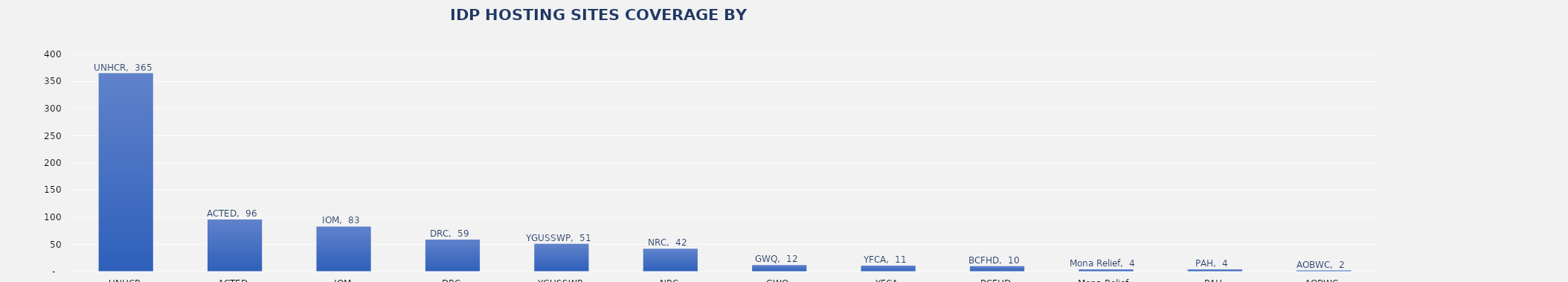
| Category | Total |
|---|---|
| UNHCR | 365 |
| ACTED | 96 |
| IOM | 83 |
| DRC | 59 |
| YGUSSWP | 51 |
| NRC | 42 |
| GWQ | 12 |
| YFCA | 11 |
| BCFHD | 10 |
| Mona Relief | 4 |
| PAH | 4 |
| AOBWC | 2 |